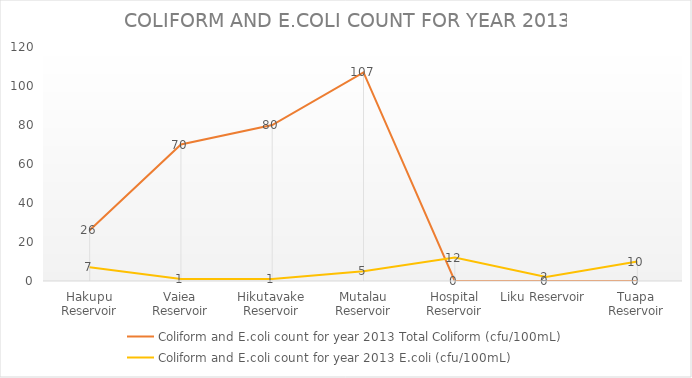
| Category | Coliform and E.coli count for year 2013 |
|---|---|
| Hakupu Reservoir | 7 |
| Vaiea Reservoir | 1 |
| Hikutavake Reservoir | 1 |
| Mutalau Reservoir | 5 |
| Hospital Reservoir | 12 |
| Liku Reservoir | 2 |
| Tuapa Reservoir | 10 |